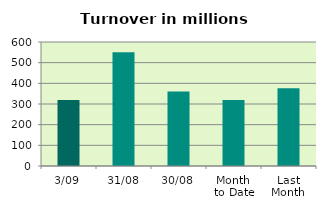
| Category | Series 0 |
|---|---|
| 3/09 | 319.871 |
| 31/08 | 550.62 |
| 30/08 | 360.432 |
| Month 
to Date | 319.871 |
| Last
Month | 376.258 |